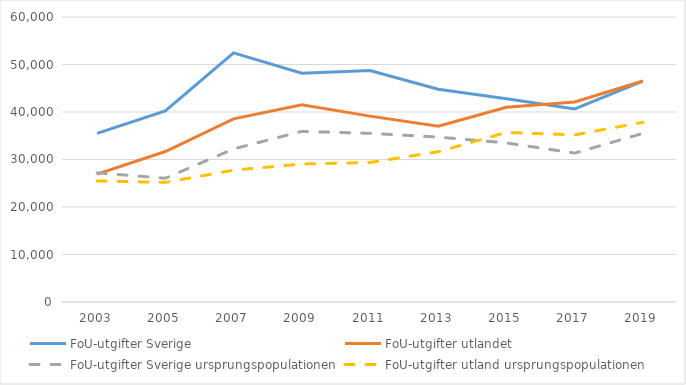
| Category | FoU-utgifter Sverige | FoU-utgifter utlandet | FoU-utgifter Sverige ursprungspopulationen | FoU-utgifter utland ursprungspopulationen |
|---|---|---|---|---|
| 2003.0 | 35492.815 | 26929.8 | 27194.015 | 25474.975 |
| 2005.0 | 40249.031 | 31685.48 | 26048.877 | 25183.195 |
| 2007.0 | 52440.656 | 38557.837 | 32227.31 | 27751.848 |
| 2009.0 | 48169.769 | 41515.138 | 35917.565 | 29053.172 |
| 2011.0 | 48742.074 | 39132.929 | 35511.455 | 29369.039 |
| 2013.0 | 44783.859 | 37011.369 | 34719.612 | 31634.859 |
| 2015.0 | 42767.004 | 40982.184 | 33492.915 | 35702.953 |
| 2017.0 | 40632.835 | 42097.526 | 31350.497 | 35183.089 |
| 2019.0 | 46493 | 46526 | 35490 | 37830 |